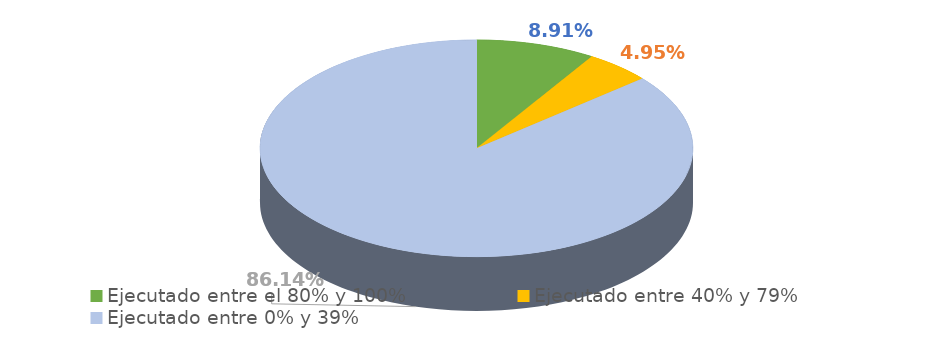
| Category | Series 0 |
|---|---|
| Ejecutado entre el 80% y 100% | 0.089 |
| Ejecutado entre 40% y 79% | 0.05 |
| Ejecutado entre 0% y 39% | 0.861 |